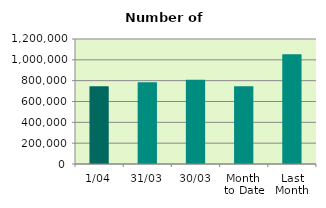
| Category | Series 0 |
|---|---|
| 1/04 | 746604 |
| 31/03 | 783734 |
| 30/03 | 809042 |
| Month 
to Date | 746604 |
| Last
Month | 1053589.478 |